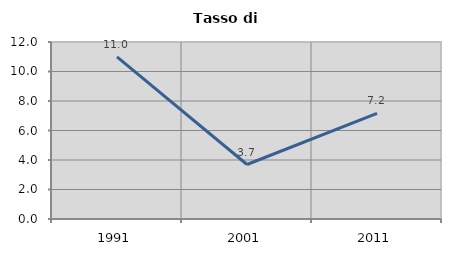
| Category | Tasso di disoccupazione   |
|---|---|
| 1991.0 | 10.997 |
| 2001.0 | 3.694 |
| 2011.0 | 7.16 |